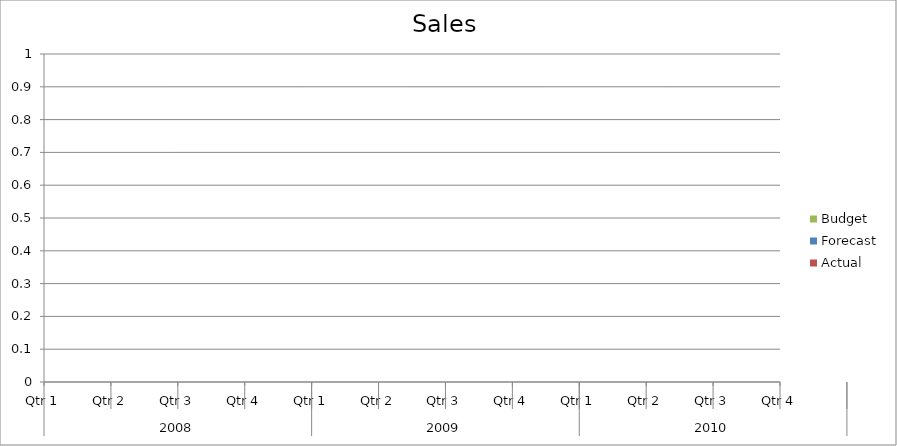
| Category | Budget | Forecast | Actual |
|---|---|---|---|
| 0 | 880 | 1820 | 1900 |
| 1 | 3000 | 1510 | 3390 |
| 2 | 680 | 580 | 3120 |
| 3 | 1110 | 2830 | 3410 |
| 4 | 2570 | 860 | 2230 |
| 5 | 1430 | 3320 | 700 |
| 6 | 1280 | 1230 | 3190 |
| 7 | 730 | 1170 | 2170 |
| 8 | 3000 | 3210 | 2420 |
| 9 | 2300 | 850 | 1410 |
| 10 | 650 | 1080 | 1160 |
| 11 | 2990 | 3130 | 810 |